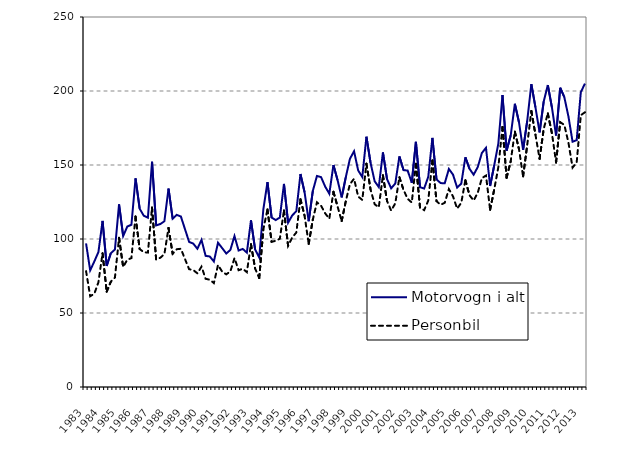
| Category | Motorvogn i alt | Personbil |
|---|---|---|
| 1983.0 | 97 | 78.3 |
| nan | 78.8 | 61.3 |
| nan | 84.8 | 63 |
| nan | 91.2 | 70.8 |
| 1984.0 | 112.2 | 90.4 |
| nan | 81.8 | 64.4 |
| nan | 90.4 | 71.1 |
| nan | 92.9 | 73.9 |
| 1985.0 | 123.4 | 100.8 |
| nan | 102 | 81.1 |
| nan | 108.4 | 86 |
| nan | 109.6 | 87.1 |
| 1986.0 | 141 | 115.2 |
| nan | 120.5 | 93.2 |
| nan | 115.7 | 91.1 |
| nan | 114.4 | 90.8 |
| 1987.0 | 152.2 | 121.3 |
| nan | 109.2 | 86.1 |
| nan | 110.1 | 87.3 |
| nan | 112 | 89.8 |
| 1988.0 | 134.1 | 107.5 |
| nan | 113.7 | 90 |
| nan | 116.3 | 93.1 |
| nan | 115.2 | 93.4 |
| 1989.0 | 106.6 | 86.4 |
| nan | 98 | 79.6 |
| nan | 96.9 | 79 |
| nan | 93.4 | 76.8 |
| 1990.0 | 99.4 | 81.3 |
| nan | 88.6 | 73.1 |
| nan | 88.2 | 72.5 |
| nan | 84.8 | 70.2 |
| 1991.0 | 97.5 | 82.4 |
| nan | 93.9 | 78 |
| nan | 90.2 | 76.1 |
| nan | 92.6 | 78.1 |
| 1992.0 | 102 | 87.1 |
| nan | 92.2 | 78.9 |
| nan | 93.3 | 79.9 |
| nan | 90.8 | 77.6 |
| 1993.0 | 112.6 | 96.5 |
| nan | 93 | 80.1 |
| nan | 87.5 | 73.6 |
| nan | 120.1 | 106.6 |
| 1994.0 | 138.4 | 120 |
| nan | 114.5 | 98.1 |
| nan | 112.8 | 98.8 |
| nan | 114.5 | 100.2 |
| 1995.0 | 137.2 | 119.3 |
| nan | 111 | 95.4 |
| nan | 115.9 | 101 |
| nan | 118.8 | 104.4 |
| 1996.0 | 143.9 | 126.9 |
| nan | 131.6 | 115.7 |
| nan | 112 | 96.7 |
| nan | 132.5 | 113.1 |
| 1997.0 | 142.6 | 124.8 |
| nan | 141.8 | 122.5 |
| nan | 135.4 | 117.3 |
| nan | 130.6 | 113.7 |
| 1998.0 | 150 | 131.9 |
| nan | 139.8 | 122 |
| nan | 128.1 | 112.1 |
| nan | 141.8 | 125.6 |
| 1999.0 | 154.2 | 137.1 |
| nan | 159.3 | 140.7 |
| nan | 146.3 | 128.7 |
| nan | 141.9 | 126.4 |
| 2000.0 | 169.1 | 150.9 |
| nan | 151.5 | 133.4 |
| nan | 139 | 123.5 |
| nan | 135.1 | 121.4 |
| 2001.0 | 158.5 | 143.1 |
| nan | 140.46 | 125.7 |
| nan | 134.24 | 119.2 |
| nan | 137.495 | 124.072 |
| 2002.0 | 155.814 | 141.724 |
| nan | 146.543 | 133.19 |
| nan | 146.231 | 127.141 |
| nan | 137.967 | 124.641 |
| 2003.0 | 165.679 | 150.811 |
| nan | 135.021 | 121.101 |
| nan | 134.111 | 119.491 |
| nan | 142.013 | 125.959 |
| 2004.0 | 168.309 | 153.043 |
| nan | 140.267 | 125.568 |
| nan | 137.77 | 123.121 |
| nan | 137.685 | 124.506 |
| 2005.0 | 147.311 | 133.756 |
| nan | 143.517 | 128.79 |
| nan | 134.783 | 120.571 |
| nan | 137.37 | 124.382 |
| 2006.0 | 155.213 | 139.728 |
| nan | 147.444 | 129.572 |
| nan | 143.451 | 126.006 |
| nan | 148.561 | 131.195 |
| 2007.0 | 158.1 | 141.084 |
| nan | 161.613 | 142.897 |
| nan | 135.821 | 119.753 |
| nan | 149.791 | 133.498 |
| 2008.0 | 164.642 | 148.614 |
| nan | 197.287 | 175.714 |
| nan | 159.718 | 141.407 |
| nan | 170.057 | 152.54 |
| 2009.0 | 191.38 | 172.559 |
| nan | 178.906 | 160.765 |
| nan | 160.234 | 142.312 |
| nan | 179.857 | 163.532 |
| 2010.0 | 204.636 | 186.507 |
| nan | 188.957 | 170.463 |
| nan | 172.077 | 154.156 |
| nan | 192.961 | 174.399 |
| 2011.0 | 204.005 | 184.86 |
| nan | 188.741 | 171.333 |
| nan | 169.934 | 151.694 |
| nan | 202.176 | 178.919 |
| 2012.0 | 195.829 | 177.072 |
| nan | 182.751 | 165.128 |
| nan | 165.73 | 148.242 |
| nan | 166.805 | 151.728 |
| 2013.0 | 199.181 | 183.653 |
| nan | 205.015 | 185.634 |